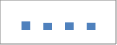
| Category | Data1 |
|---|---|
| 0 | 115 |
| 1 | 95 |
| 2 | 102 |
| 3 | 96 |